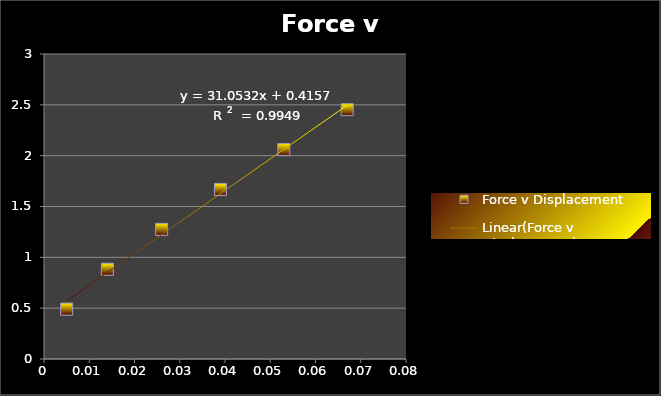
| Category | Force v Displacement |
|---|---|
| 0.005 | 0.49 |
| 0.014 | 0.883 |
| 0.026 | 1.275 |
| 0.039 | 1.668 |
| 0.053 | 2.06 |
| 0.067 | 2.452 |